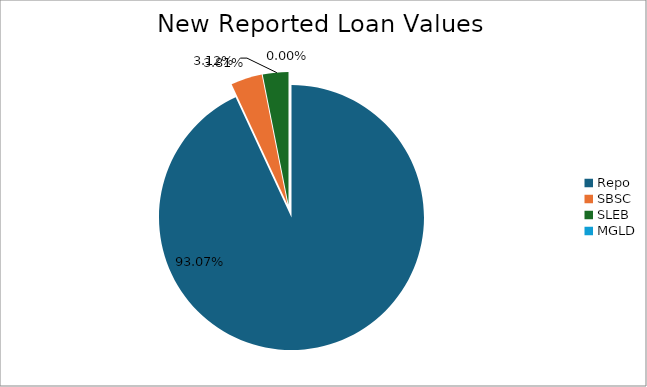
| Category | Series 0 |
|---|---|
| Repo | 13257258.938 |
| SBSC | 542625.403 |
| SLEB | 444041.739 |
| MGLD | 175.461 |